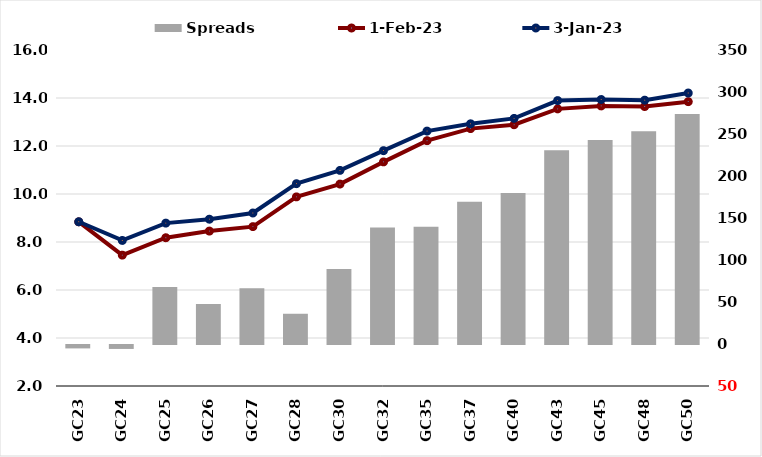
| Category |  Spreads   |
|---|---|
| GC23 | -4.056 |
| GC24 | -4.701 |
| GC25 | 67.799 |
| GC26 | 47.747 |
| GC27 | 66.312 |
| GC28 | 35.999 |
| GC30 | 89.389 |
| GC32 | 138.75 |
| GC35 | 139.628 |
| GC37 | 169.467 |
| GC40 | 179.661 |
| GC43 | 230.673 |
| GC45 | 242.969 |
| GC48 | 253.391 |
| GC50 | 273.782 |